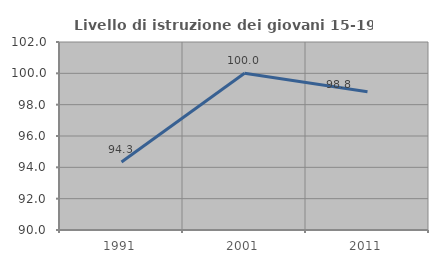
| Category | Livello di istruzione dei giovani 15-19 anni |
|---|---|
| 1991.0 | 94.34 |
| 2001.0 | 100 |
| 2011.0 | 98.824 |